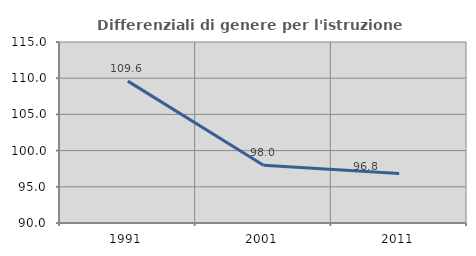
| Category | Differenziali di genere per l'istruzione superiore |
|---|---|
| 1991.0 | 109.596 |
| 2001.0 | 97.975 |
| 2011.0 | 96.85 |